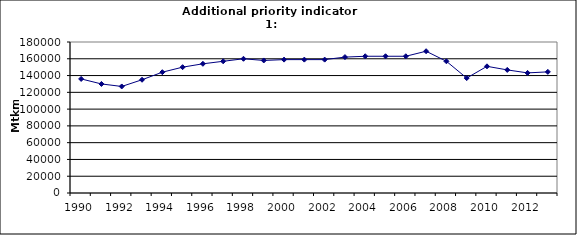
| Category | Freight transport on road, Mtkm |
|---|---|
| 1990 | 136000 |
| 1991 | 130000 |
| 1992 | 127000 |
| 1993 | 135000 |
| 1994 | 144000 |
| 1995 | 150000 |
| 1996 | 154000 |
| 1997 | 157000 |
| 1998 | 160000 |
| 1999 | 158000 |
| 2000 | 159000 |
| 2001 | 159000 |
| 2002 | 159000 |
| 2003 | 162000 |
| 2004 | 163000 |
| 2005 | 163000 |
| 2006 | 163000 |
| 2007 | 169000 |
| 2008 | 157000 |
| 2009 | 137000 |
| 2010 | 151000 |
| 2011 | 146733.342 |
| 2012 | 143166.761 |
| 2013 | 144405.663 |